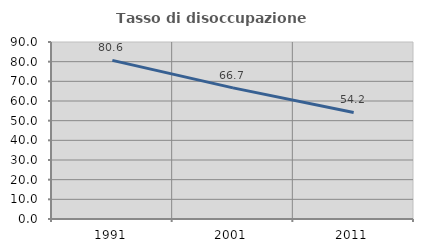
| Category | Tasso di disoccupazione giovanile  |
|---|---|
| 1991.0 | 80.645 |
| 2001.0 | 66.667 |
| 2011.0 | 54.167 |